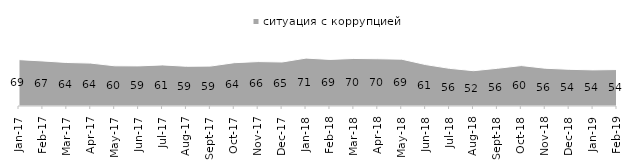
| Category | ситуация с коррупцией |
|---|---|
| 2017-01-01 | 68.7 |
| 2017-02-01 | 66.7 |
| 2017-03-01 | 64.45 |
| 2017-04-01 | 63.55 |
| 2017-05-01 | 59.55 |
| 2017-06-01 | 59.4 |
| 2017-07-01 | 60.85 |
| 2017-08-01 | 58.85 |
| 2017-09-01 | 59.1 |
| 2017-10-01 | 64.15 |
| 2017-11-01 | 65.8 |
| 2017-12-01 | 65.2 |
| 2018-01-01 | 70.95 |
| 2018-02-01 | 69 |
| 2018-03-01 | 70.4 |
| 2018-04-01 | 70 |
| 2018-05-01 | 69.35 |
| 2018-06-01 | 61.35 |
| 2018-07-01 | 55.75 |
| 2018-08-01 | 52.3 |
| 2018-09-01 | 55.85 |
| 2018-10-01 | 59.9 |
| 2018-11-01 | 55.938 |
| 2018-12-01 | 54.35 |
| 2019-01-01 | 53.5 |
| 2019-02-01 | 54 |